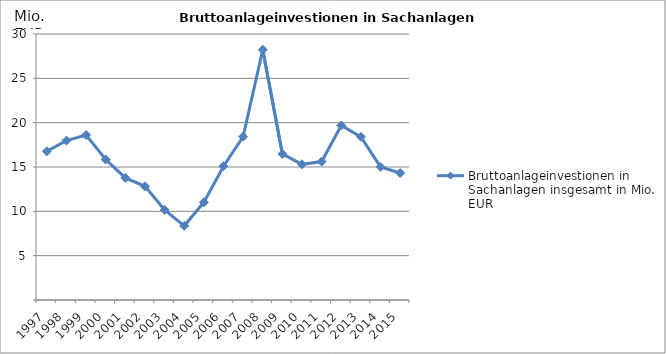
| Category | Bruttoanlageinvestionen in Sachanlagen insgesamt in Mio. EUR |
|---|---|
| 1997.0 | 16.771 |
| 1998.0 | 17.982 |
| 1999.0 | 18.612 |
| 2000.0 | 15.842 |
| 2001.0 | 13.772 |
| 2002.0 | 12.821 |
| 2003.0 | 10.169 |
| 2004.0 | 8.366 |
| 2005.0 | 11.018 |
| 2006.0 | 15.093 |
| 2007.0 | 18.424 |
| 2008.0 | 28.234 |
| 2009.0 | 16.475 |
| 2010.0 | 15.298 |
| 2011.0 | 15.615 |
| 2012.0 | 19.688 |
| 2013.0 | 18.402 |
| 2014.0 | 15.014 |
| 2015.0 | 14.325 |